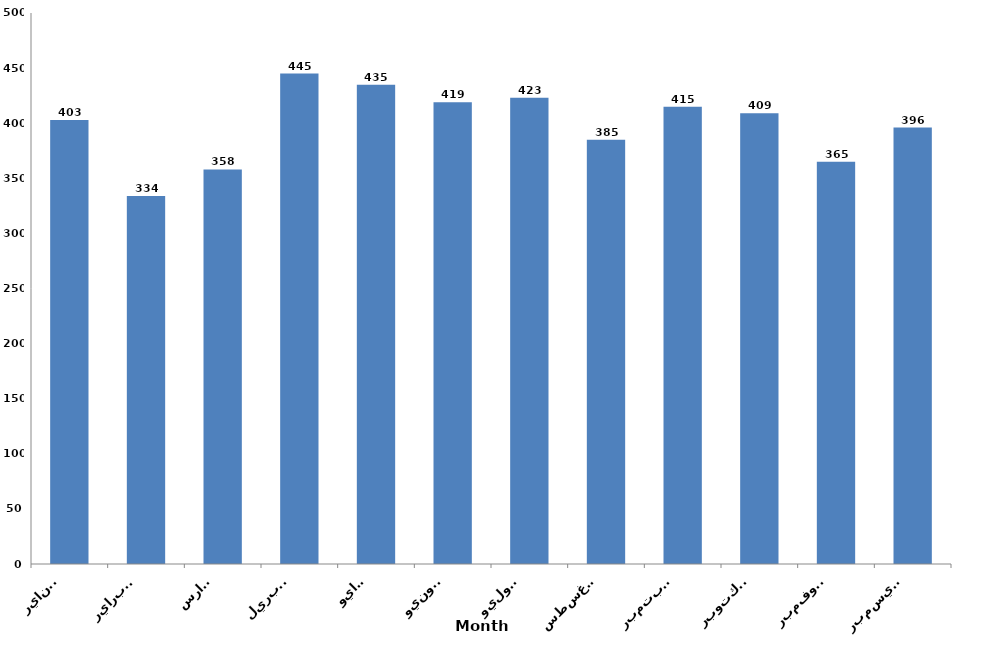
| Category | الشهور
 Month |
|---|---|
| يناير
January | 403 |
| فبراير
February | 334 |
| مارس
March | 358 |
| ابريل
April | 445 |
| مايو
May | 435 |
| يونيو
June | 419 |
| يوليو
July | 423 |
| اغسطس
August | 385 |
| سبتمبر
September | 415 |
| اكتوبر
October | 409 |
| نوفمبر
November | 365 |
| ديسمبر
December | 396 |